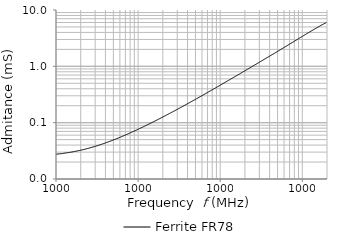
| Category | Ferrite FR78 |
|---|---|
| 10000.0 | 0.028 |
| 10192.3 | 0.028 |
| 10388.3 | 0.028 |
| 10588.1 | 0.028 |
| 10791.8 | 0.028 |
| 10999.3 | 0.028 |
| 11210.9 | 0.028 |
| 11426.5 | 0.028 |
| 11646.2 | 0.028 |
| 11870.2 | 0.028 |
| 12098.5 | 0.028 |
| 12331.2 | 0.029 |
| 12568.4 | 0.029 |
| 12810.1 | 0.029 |
| 13056.5 | 0.029 |
| 13307.6 | 0.029 |
| 13563.5 | 0.029 |
| 13824.4 | 0.029 |
| 14090.2 | 0.029 |
| 14361.2 | 0.03 |
| 14637.4 | 0.03 |
| 14919.0 | 0.03 |
| 15205.9 | 0.03 |
| 15498.3 | 0.03 |
| 15796.4 | 0.03 |
| 16100.2 | 0.03 |
| 16409.9 | 0.031 |
| 16725.5 | 0.031 |
| 17047.1 | 0.031 |
| 17375.0 | 0.031 |
| 17709.2 | 0.031 |
| 18049.7 | 0.031 |
| 18396.9 | 0.032 |
| 18750.7 | 0.032 |
| 19111.3 | 0.032 |
| 19478.9 | 0.032 |
| 19853.5 | 0.032 |
| 20235.3 | 0.033 |
| 20624.5 | 0.033 |
| 21021.2 | 0.033 |
| 21425.5 | 0.033 |
| 21837.5 | 0.033 |
| 22257.5 | 0.034 |
| 22685.6 | 0.034 |
| 23121.9 | 0.034 |
| 23566.6 | 0.034 |
| 24019.8 | 0.035 |
| 24481.8 | 0.035 |
| 24952.6 | 0.035 |
| 25432.5 | 0.035 |
| 25921.7 | 0.036 |
| 26420.2 | 0.036 |
| 26928.3 | 0.036 |
| 27446.2 | 0.037 |
| 27974.1 | 0.037 |
| 28512.1 | 0.037 |
| 29060.5 | 0.037 |
| 29619.4 | 0.038 |
| 30189.0 | 0.038 |
| 30769.6 | 0.038 |
| 31361.4 | 0.039 |
| 31964.6 | 0.039 |
| 32579.3 | 0.039 |
| 33205.9 | 0.04 |
| 33844.5 | 0.04 |
| 34495.4 | 0.041 |
| 35158.9 | 0.041 |
| 35835.1 | 0.041 |
| 36524.3 | 0.042 |
| 37226.7 | 0.042 |
| 37942.7 | 0.042 |
| 38672.4 | 0.043 |
| 39416.2 | 0.043 |
| 40174.3 | 0.044 |
| 40946.9 | 0.044 |
| 41734.4 | 0.045 |
| 42537.1 | 0.045 |
| 43355.2 | 0.046 |
| 44189.0 | 0.046 |
| 45038.9 | 0.046 |
| 45905.1 | 0.047 |
| 46787.9 | 0.047 |
| 47687.8 | 0.048 |
| 48604.9 | 0.049 |
| 49539.7 | 0.049 |
| 50492.5 | 0.05 |
| 51463.6 | 0.05 |
| 52453.4 | 0.051 |
| 53462.2 | 0.051 |
| 54490.4 | 0.052 |
| 55538.4 | 0.052 |
| 56606.5 | 0.053 |
| 57695.2 | 0.054 |
| 58804.8 | 0.054 |
| 59935.8 | 0.055 |
| 61088.5 | 0.055 |
| 62263.4 | 0.056 |
| 63460.9 | 0.057 |
| 64681.4 | 0.057 |
| 65925.4 | 0.058 |
| 67193.3 | 0.059 |
| 68485.6 | 0.06 |
| 69802.7 | 0.06 |
| 71145.2 | 0.061 |
| 72513.5 | 0.062 |
| 73908.1 | 0.062 |
| 75329.5 | 0.063 |
| 76778.3 | 0.064 |
| 78255.0 | 0.065 |
| 79760.0 | 0.066 |
| 81294.0 | 0.066 |
| 82857.5 | 0.067 |
| 84451.0 | 0.068 |
| 86075.2 | 0.069 |
| 87730.7 | 0.07 |
| 89417.9 | 0.071 |
| 91137.7 | 0.072 |
| 92890.5 | 0.073 |
| 94677.0 | 0.074 |
| 96497.9 | 0.075 |
| 98353.8 | 0.075 |
| 100245.0 | 0.076 |
| 102173.0 | 0.077 |
| 104138.0 | 0.078 |
| 106141.0 | 0.08 |
| 108183.0 | 0.081 |
| 110263.0 | 0.082 |
| 112384.0 | 0.083 |
| 114545.0 | 0.084 |
| 116748.0 | 0.085 |
| 118994.0 | 0.086 |
| 121282.0 | 0.087 |
| 123615.0 | 0.088 |
| 125992.0 | 0.09 |
| 128415.0 | 0.091 |
| 130885.0 | 0.092 |
| 133402.0 | 0.093 |
| 135968.0 | 0.095 |
| 138583.0 | 0.096 |
| 141248.0 | 0.097 |
| 143965.0 | 0.099 |
| 146734.0 | 0.1 |
| 149556.0 | 0.102 |
| 152432.0 | 0.103 |
| 155364.0 | 0.104 |
| 158352.0 | 0.106 |
| 161397.0 | 0.107 |
| 164501.0 | 0.109 |
| 167665.0 | 0.11 |
| 170890.0 | 0.112 |
| 174176.0 | 0.114 |
| 177526.0 | 0.115 |
| 180940.0 | 0.117 |
| 184420.0 | 0.119 |
| 187967.0 | 0.12 |
| 191582.0 | 0.122 |
| 195267.0 | 0.124 |
| 199022.0 | 0.126 |
| 202850.0 | 0.127 |
| 206751.0 | 0.129 |
| 210728.0 | 0.131 |
| 214780.0 | 0.133 |
| 218911.0 | 0.135 |
| 223121.0 | 0.137 |
| 227413.0 | 0.139 |
| 231786.0 | 0.141 |
| 236244.0 | 0.143 |
| 240788.0 | 0.145 |
| 245419.0 | 0.147 |
| 250139.0 | 0.15 |
| 254949.0 | 0.152 |
| 259853.0 | 0.154 |
| 264850.0 | 0.156 |
| 269944.0 | 0.159 |
| 275136.0 | 0.161 |
| 280427.0 | 0.163 |
| 285821.0 | 0.166 |
| 291318.0 | 0.168 |
| 296920.0 | 0.171 |
| 302631.0 | 0.174 |
| 308451.0 | 0.176 |
| 314383.0 | 0.179 |
| 320430.0 | 0.182 |
| 326593.0 | 0.184 |
| 332874.0 | 0.187 |
| 339276.0 | 0.19 |
| 345801.0 | 0.193 |
| 352451.0 | 0.196 |
| 359230.0 | 0.199 |
| 366139.0 | 0.202 |
| 373181.0 | 0.205 |
| 380358.0 | 0.208 |
| 387673.0 | 0.211 |
| 395129.0 | 0.215 |
| 402728.0 | 0.218 |
| 410474.0 | 0.221 |
| 418368.0 | 0.225 |
| 426414.0 | 0.228 |
| 434615.0 | 0.232 |
| 442974.0 | 0.235 |
| 451494.0 | 0.239 |
| 460177.0 | 0.243 |
| 469027.0 | 0.247 |
| 478048.0 | 0.25 |
| 487242.0 | 0.254 |
| 496613.0 | 0.258 |
| 506164.0 | 0.262 |
| 515899.0 | 0.266 |
| 525821.0 | 0.271 |
| 535934.0 | 0.275 |
| 546241.0 | 0.279 |
| 556746.0 | 0.284 |
| 567454.0 | 0.288 |
| 578368.0 | 0.293 |
| 589491.0 | 0.297 |
| 600828.0 | 0.302 |
| 612384.0 | 0.307 |
| 624162.0 | 0.312 |
| 636166.0 | 0.317 |
| 648401.0 | 0.322 |
| 660871.0 | 0.327 |
| 673581.0 | 0.332 |
| 686536.0 | 0.337 |
| 699740.0 | 0.343 |
| 713198.0 | 0.348 |
| 726914.0 | 0.354 |
| 740894.0 | 0.359 |
| 755144.0 | 0.365 |
| 769667.0 | 0.371 |
| 784470.0 | 0.377 |
| 799557.0 | 0.383 |
| 814934.0 | 0.389 |
| 830608.0 | 0.395 |
| 846582.0 | 0.401 |
| 862864.0 | 0.408 |
| 879459.0 | 0.414 |
| 896373.0 | 0.421 |
| 913613.0 | 0.428 |
| 931184.0 | 0.435 |
| 949093.0 | 0.442 |
| 967346.0 | 0.449 |
| 985951.0 | 0.456 |
| 1004910.0 | 0.464 |
| 1024240.0 | 0.472 |
| 1043940.0 | 0.48 |
| 1064020.0 | 0.487 |
| 1084480.0 | 0.495 |
| 1105340.0 | 0.503 |
| 1126600.0 | 0.511 |
| 1148260.0 | 0.52 |
| 1170350.0 | 0.528 |
| 1192860.0 | 0.537 |
| 1215800.0 | 0.546 |
| 1239180.0 | 0.554 |
| 1263010.0 | 0.564 |
| 1287300.0 | 0.573 |
| 1312060.0 | 0.582 |
| 1337300.0 | 0.592 |
| 1363010.0 | 0.601 |
| 1389230.0 | 0.611 |
| 1415950.0 | 0.621 |
| 1443180.0 | 0.631 |
| 1470940.0 | 0.641 |
| 1499230.0 | 0.652 |
| 1528060.0 | 0.663 |
| 1557450.0 | 0.674 |
| 1587400.0 | 0.685 |
| 1617930.0 | 0.696 |
| 1649050.0 | 0.707 |
| 1680760.0 | 0.719 |
| 1713090.0 | 0.73 |
| 1746040.0 | 0.743 |
| 1779620.0 | 0.755 |
| 1813840.0 | 0.767 |
| 1848730.0 | 0.78 |
| 1884280.0 | 0.793 |
| 1920520.0 | 0.806 |
| 1957460.0 | 0.819 |
| 1995110.0 | 0.832 |
| 2033480.0 | 0.846 |
| 2072580.0 | 0.86 |
| 2112450.0 | 0.874 |
| 2153070.0 | 0.888 |
| 2194480.0 | 0.903 |
| 2236690.0 | 0.918 |
| 2279700.0 | 0.933 |
| 2323550.0 | 0.948 |
| 2368240.0 | 0.964 |
| 2413780.0 | 0.98 |
| 2460210.0 | 0.996 |
| 2507520.0 | 1.013 |
| 2555750.0 | 1.029 |
| 2604900.0 | 1.046 |
| 2655000.0 | 1.064 |
| 2706060.0 | 1.081 |
| 2758110.0 | 1.099 |
| 2811150.0 | 1.117 |
| 2865220.0 | 1.136 |
| 2920320.0 | 1.154 |
| 2976490.0 | 1.174 |
| 3033730.0 | 1.193 |
| 3092080.0 | 1.213 |
| 3151550.0 | 1.233 |
| 3212160.0 | 1.253 |
| 3273940.0 | 1.274 |
| 3336900.0 | 1.295 |
| 3401080.0 | 1.317 |
| 3466490.0 | 1.339 |
| 3533160.0 | 1.361 |
| 3601110.0 | 1.384 |
| 3670370.0 | 1.407 |
| 3740960.0 | 1.43 |
| 3812910.0 | 1.454 |
| 3886240.0 | 1.478 |
| 3960980.0 | 1.503 |
| 4037160.0 | 1.528 |
| 4114810.0 | 1.554 |
| 4193950.0 | 1.58 |
| 4274610.0 | 1.606 |
| 4356820.0 | 1.633 |
| 4440610.0 | 1.66 |
| 4526010.0 | 1.688 |
| 4613060.0 | 1.716 |
| 4701780.0 | 1.745 |
| 4792210.0 | 1.774 |
| 4884370.0 | 1.804 |
| 4978310.0 | 1.834 |
| 5074060.0 | 1.865 |
| 5171640.0 | 1.897 |
| 5271110.0 | 1.929 |
| 5372480.0 | 1.962 |
| 5475810.0 | 1.995 |
| 5581120.0 | 2.029 |
| 5688460.0 | 2.063 |
| 5797870.0 | 2.098 |
| 5909370.0 | 2.133 |
| 6023030.0 | 2.169 |
| 6138860.0 | 2.206 |
| 6256930.0 | 2.243 |
| 6377270.0 | 2.281 |
| 6499920.0 | 2.32 |
| 6624930.0 | 2.359 |
| 6752340.0 | 2.399 |
| 6882200.0 | 2.44 |
| 7014570.0 | 2.481 |
| 7149470.0 | 2.523 |
| 7286980.0 | 2.566 |
| 7427120.0 | 2.61 |
| 7569960.0 | 2.654 |
| 7715550.0 | 2.699 |
| 7863940.0 | 2.745 |
| 8015190.0 | 2.792 |
| 8169340.0 | 2.84 |
| 8326450.0 | 2.888 |
| 8486590.0 | 2.937 |
| 8649810.0 | 2.987 |
| 8816170.0 | 3.038 |
| 8985730.0 | 3.09 |
| 9158540.0 | 3.143 |
| 9334690.0 | 3.197 |
| 9514210.0 | 3.252 |
| 9697200.0 | 3.307 |
| 9883700.0 | 3.363 |
| 10073800.0 | 3.42 |
| 10267500.0 | 3.478 |
| 10465000.0 | 3.537 |
| 10666300.0 | 3.597 |
| 10871400.0 | 3.658 |
| 11080500.0 | 3.72 |
| 11293600.0 | 3.783 |
| 11510800.0 | 3.847 |
| 11732200.0 | 3.912 |
| 11957800.0 | 3.977 |
| 12187800.0 | 4.044 |
| 12422200.0 | 4.112 |
| 12661100.0 | 4.18 |
| 12904600.0 | 4.25 |
| 13152800.0 | 4.32 |
| 13405800.0 | 4.392 |
| 13663600.0 | 4.464 |
| 13926400.0 | 4.538 |
| 14194200.0 | 4.612 |
| 14467200.0 | 4.687 |
| 14745400.0 | 4.763 |
| 15029000.0 | 4.84 |
| 15318100.0 | 4.917 |
| 15612700.0 | 4.995 |
| 15913000.0 | 5.074 |
| 16219000.0 | 5.154 |
| 16530900.0 | 5.235 |
| 16848900.0 | 5.316 |
| 17172900.0 | 5.399 |
| 17503200.0 | 5.481 |
| 17839800.0 | 5.564 |
| 18182900.0 | 5.648 |
| 18532600.0 | 5.733 |
| 18889100.0 | 5.818 |
| 19252300.0 | 5.904 |
| 19622600.0 | 5.989 |